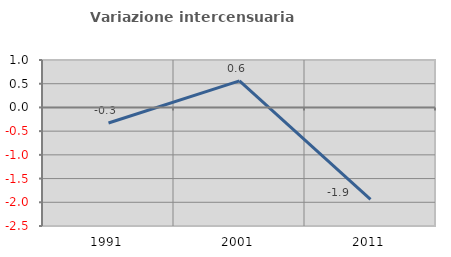
| Category | Variazione intercensuaria annua |
|---|---|
| 1991.0 | -0.327 |
| 2001.0 | 0.561 |
| 2011.0 | -1.937 |